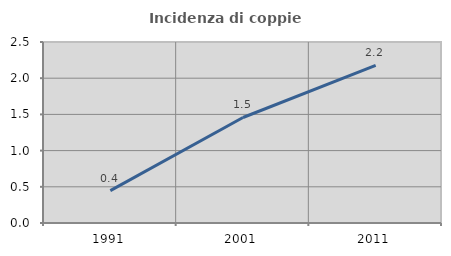
| Category | Incidenza di coppie miste |
|---|---|
| 1991.0 | 0.447 |
| 2001.0 | 1.457 |
| 2011.0 | 2.178 |